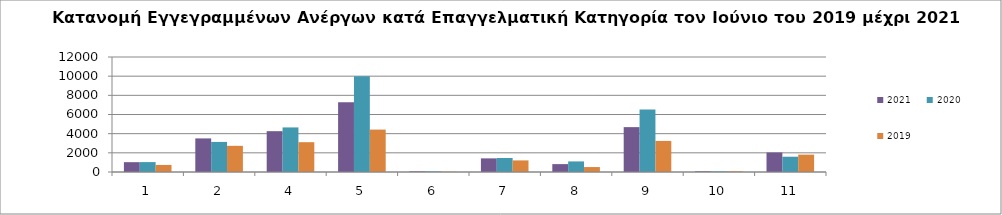
| Category | 2021 | 2020 | 2019 |
|---|---|---|---|
| 1.0 | 1027 | 1033 | 736 |
| 2.0 | 3505 | 3138 | 2731 |
| 4.0 | 4260 | 4651 | 3112 |
| 5.0 | 7274 | 9981 | 4425 |
| 6.0 | 64 | 57 | 29 |
| 7.0 | 1422 | 1463 | 1211 |
| 8.0 | 823 | 1104 | 516 |
| 9.0 | 4682 | 6510 | 3242 |
| 10.0 | 72 | 56 | 68 |
| 11.0 | 2034 | 1594 | 1813 |